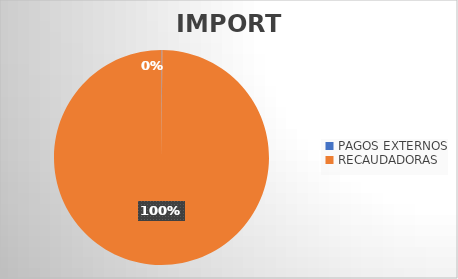
| Category | IMPORTE |
|---|---|
| PAGOS EXTERNOS | 896885.6 |
| RECAUDADORAS | 758225019.43 |